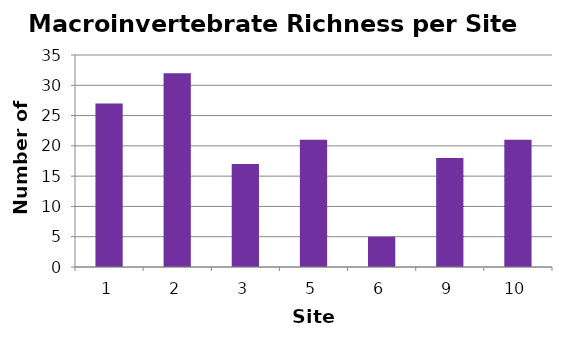
| Category | Richness |
|---|---|
| 1.0 | 27 |
| 2.0 | 32 |
| 3.0 | 17 |
| 5.0 | 21 |
| 6.0 | 5 |
| 9.0 | 18 |
| 10.0 | 21 |